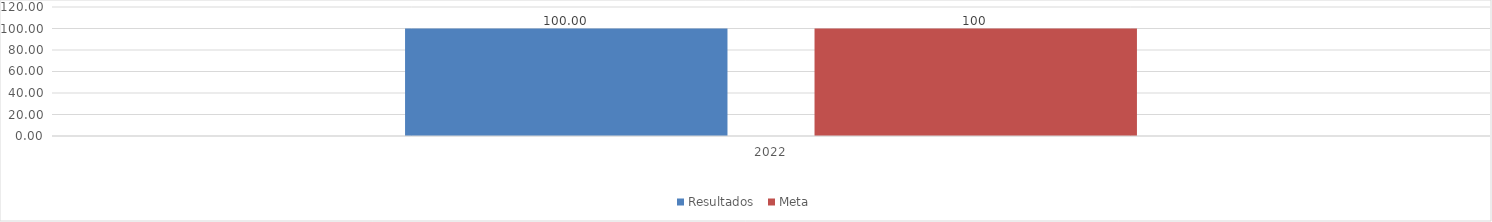
| Category | Resultados  | Meta |
|---|---|---|
| 2022 | 100 | 100 |